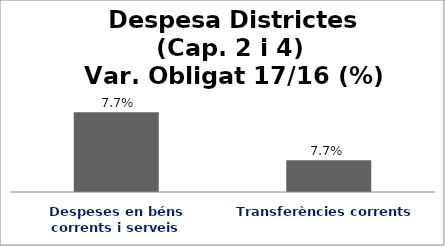
| Category | Series 0 |
|---|---|
| Despeses en béns corrents i serveis | 0.077 |
| Transferències corrents | 0.077 |